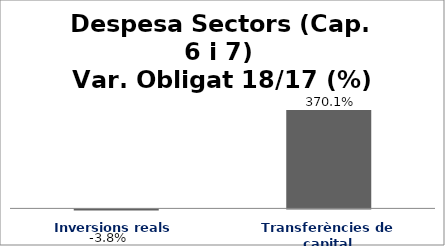
| Category | Series 0 |
|---|---|
| Inversions reals | -0.038 |
| Transferències de capital | 3.701 |